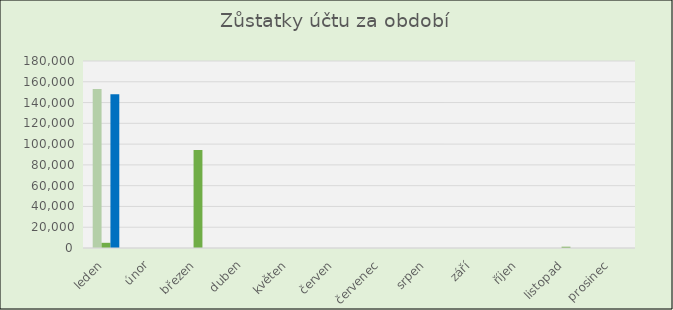
| Category | Obrat MD | Obrat D | Zůstatek |
|---|---|---|---|
| leden | 153040 | 5000 | 148040 |
| únor | 0 | 0 | 0 |
| březen | 0 | 94376.5 | 0 |
| duben | 0 | 0 | 0 |
| květen | 0 | 0 | 0 |
| červen | 0 | 0 | 0 |
| červenec | 0 | 0 | 0 |
| srpen | 0 | 0 | 0 |
| září | 0 | 0 | 0 |
| říjen | 0 | 0 | 0 |
| listopad | 0 | 1210 | 0 |
| prosinec | 0 | 0 | 0 |